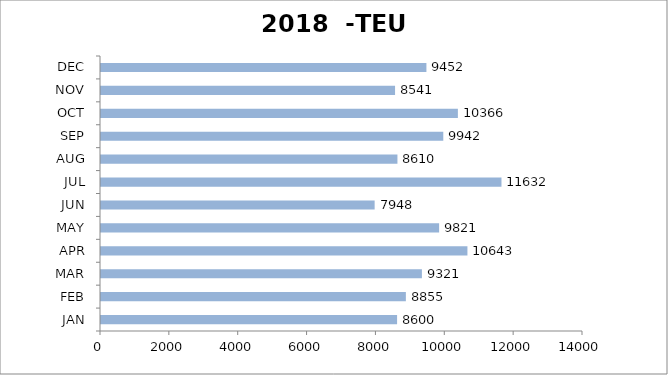
| Category | TEU |
|---|---|
| JAN | 8600 |
| FEB | 8855 |
| MAR | 9321 |
| APR | 10643 |
| MAY | 9821 |
| JUN | 7948 |
| JUL | 11632 |
| AUG | 8610 |
| SEP | 9942 |
| OCT | 10366 |
| NOV | 8541 |
| DEC | 9452 |